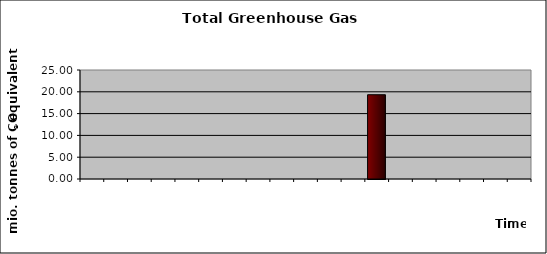
| Category | Series 0 |
|---|---|
| 1990.0 | 0 |
| 1994.0 | 0 |
| 1995.0 | 0 |
| 1996.0 | 0 |
| 1997.0 | 0 |
| 1998.0 | 0 |
| 1999.0 | 0 |
| 2000.0 | 0 |
| 2001.0 | 0 |
| 2002.0 | 0 |
| 2003.0 | 0 |
| 2004.0 | 0 |
| 2005.0 | 19.328 |
| 2006.0 | 0 |
| 2007.0 | 0 |
| 2008.0 | 0 |
| 2009.0 | 0 |
| 2010.0 | 0 |
| 2011.0 | 0 |